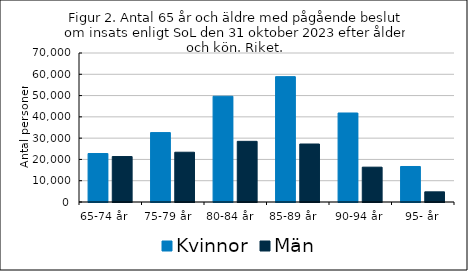
| Category | Kvinnor | Män  |
|---|---|---|
| 65-74 år    | 22771 | 21360 |
| 75-79 år       | 32601 | 23383 |
| 80-84 år      | 49681 | 28502 |
| 85-89 år        | 58895 | 27247 |
| 90-94 år | 41813 | 16368 |
| 95- år | 16684 | 4776 |